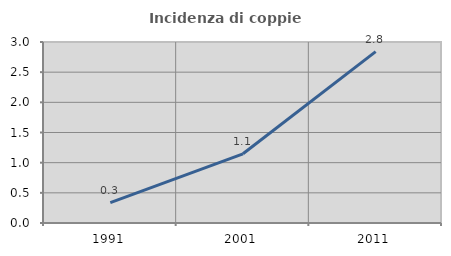
| Category | Incidenza di coppie miste |
|---|---|
| 1991.0 | 0.337 |
| 2001.0 | 1.147 |
| 2011.0 | 2.841 |